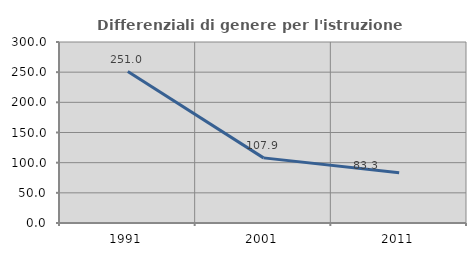
| Category | Differenziali di genere per l'istruzione superiore |
|---|---|
| 1991.0 | 250.98 |
| 2001.0 | 107.937 |
| 2011.0 | 83.333 |